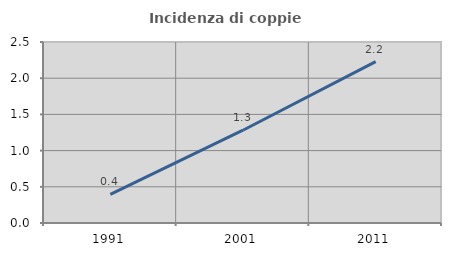
| Category | Incidenza di coppie miste |
|---|---|
| 1991.0 | 0.395 |
| 2001.0 | 1.281 |
| 2011.0 | 2.229 |